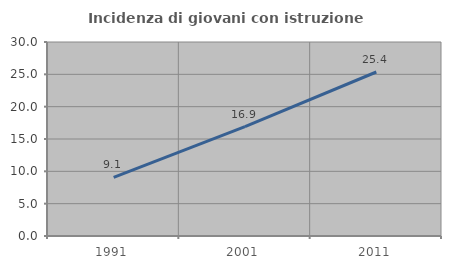
| Category | Incidenza di giovani con istruzione universitaria |
|---|---|
| 1991.0 | 9.062 |
| 2001.0 | 16.917 |
| 2011.0 | 25.362 |